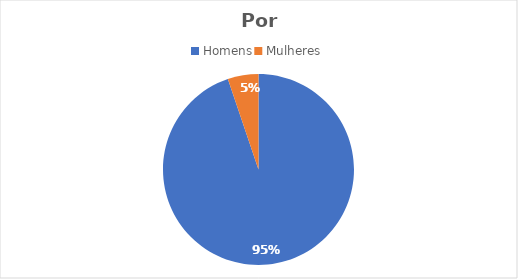
| Category | Series 0 |
|---|---|
| Homens | 73 |
| Mulheres | 4 |